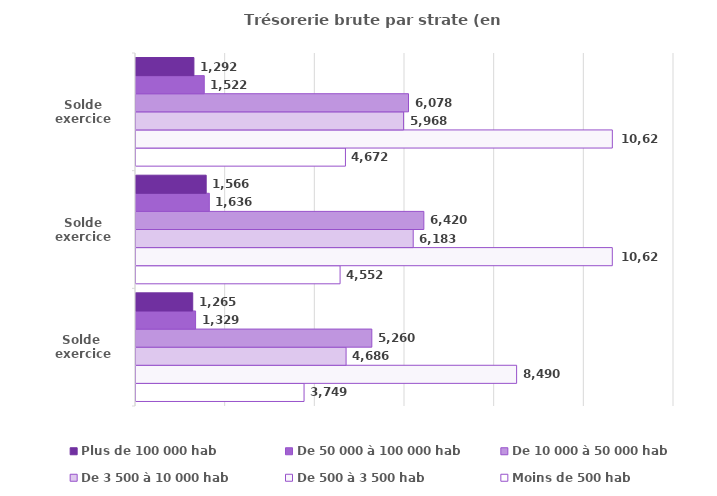
| Category | Moins de 500 hab | De 500 à 3 500 hab | De 3 500 à 10 000 hab | De 10 000 à 50 000 hab | De 50 000 à 100 000 hab | Plus de 100 000 hab |
|---|---|---|---|---|---|---|
| Solde 
exercice 2019 | 3748.5 | 8489.5 | 4685.8 | 5259.9 | 1328.9 | 1265.2 |
| Solde
exercice 2022 | 4552.1 | 10623.9 | 6183.1 | 6420.4 | 1635.8 | 1565.7 |
| Solde
exercice 2023 | 4671.7 | 10624.6 | 5968.2 | 6078.3 | 1522.4 | 1291.9 |